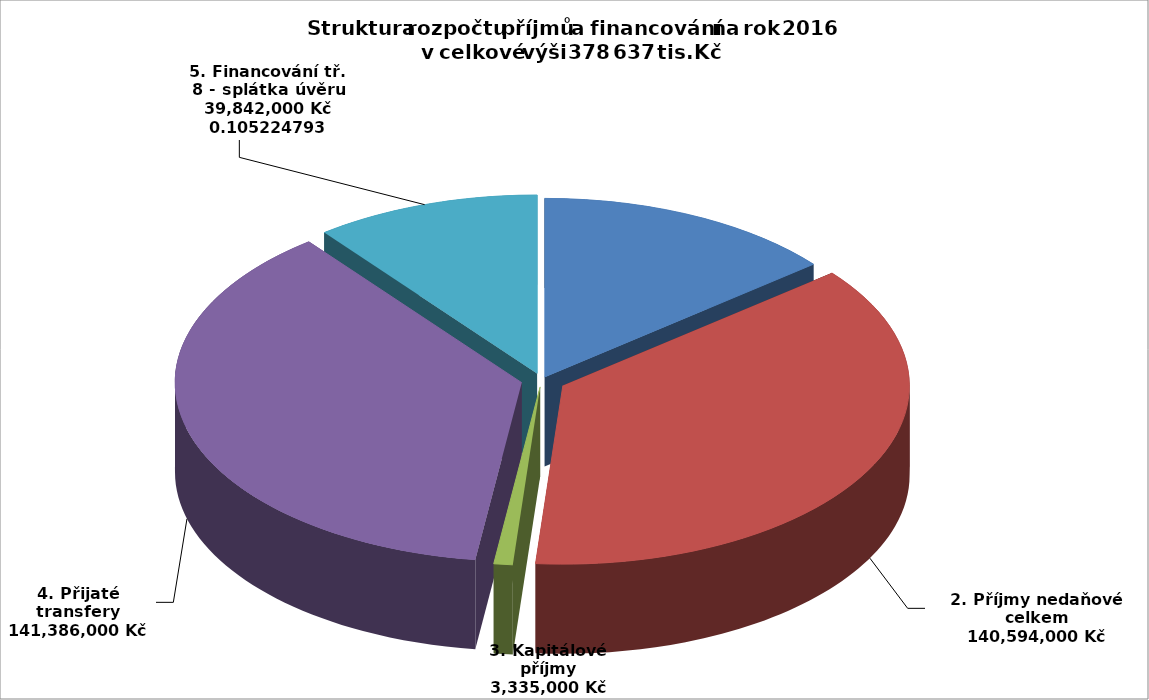
| Category | Series 0 |
|---|---|
| 1. Příjmy daňové celkem | 53480000 |
| 2. Příjmy nedaňové celkem | 140594000 |
| 3. Kapitálové příjmy | 3335000 |
| 4. Přijaté transfery | 141386000 |
| 5. Financování tř. 8 - splátka úvěru | 39842000 |